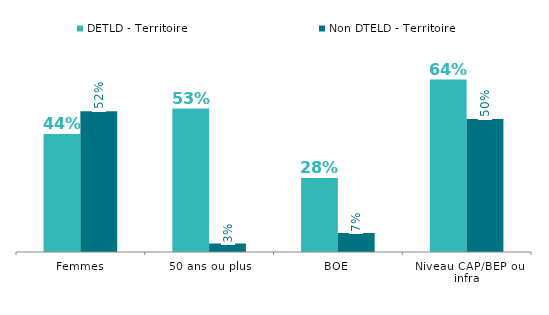
| Category | DETLD - Territoire | Non DTELD - Territoire |
|---|---|---|
| Femmes | 0.44 | 0.524 |
| 50 ans ou plus | 0.534 | 0.031 |
| BOE | 0.276 | 0.071 |
| Niveau CAP/BEP ou infra | 0.642 | 0.495 |